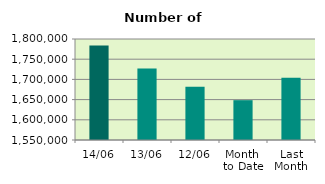
| Category | Series 0 |
|---|---|
| 14/06 | 1783604 |
| 13/06 | 1726756 |
| 12/06 | 1681566 |
| Month 
to Date | 1648557 |
| Last
Month | 1704183.636 |